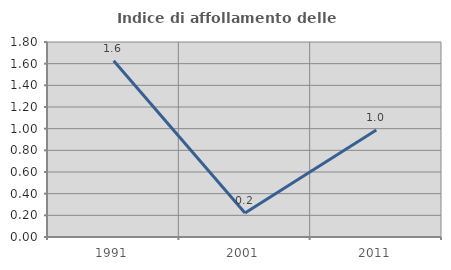
| Category | Indice di affollamento delle abitazioni  |
|---|---|
| 1991.0 | 1.626 |
| 2001.0 | 0.222 |
| 2011.0 | 0.987 |